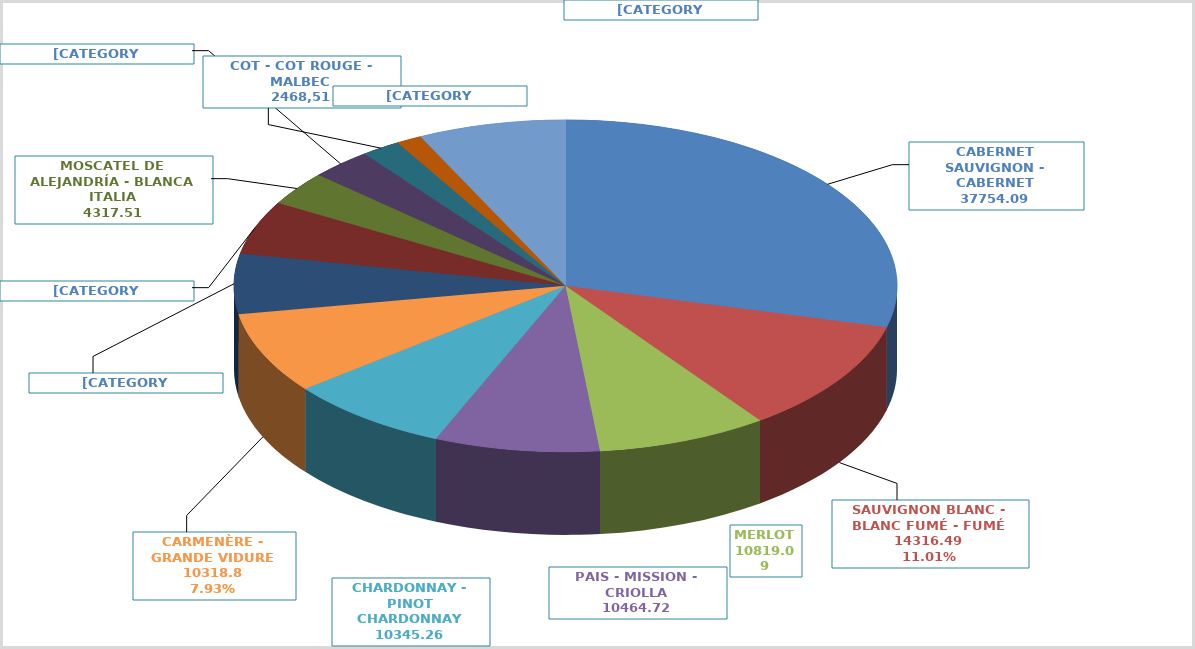
| Category | Series 0 |
|---|---|
| CABERNET SAUVIGNON - CABERNET | 37754.09 |
| SAUVIGNON BLANC - BLANC FUMÉ - FUMÉ | 14316.49 |
| MERLOT | 10819.09 |
| PAIS - MISSION - CRIOLLA | 10464.72 |
| CHARDONNAY - PINOT CHARDONNAY | 10345.26 |
| CARMENÈRE - GRANDE VIDURE | 10318.8 |
| Tintorera | 7618.48 |
| SYRAH - SIRAH - SHIRAZ | 6755.47 |
| MOSCATEL DE ALEJANDRÍA - BLANCA ITALIA | 4317.51 |
| PINOT NOIR - PINOT NEGRO | 3909.89 |
| COT - COT ROUGE - MALBEC - MALBEK - MALBECK | 2468.51 |
| CABERNET FRANC - CABERNET FRANCO | 1626.78 |
| Otras 90 variedades  | 9375.08 |